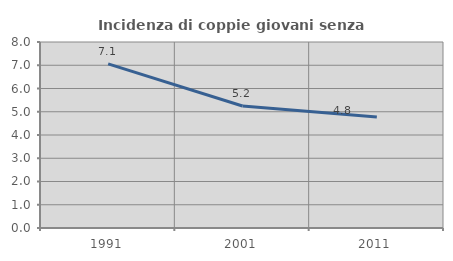
| Category | Incidenza di coppie giovani senza figli |
|---|---|
| 1991.0 | 7.061 |
| 2001.0 | 5.247 |
| 2011.0 | 4.773 |